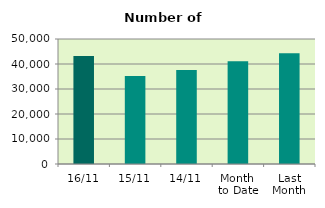
| Category | Series 0 |
|---|---|
| 16/11 | 43192 |
| 15/11 | 35246 |
| 14/11 | 37634 |
| Month 
to Date | 41148.833 |
| Last
Month | 44266.476 |